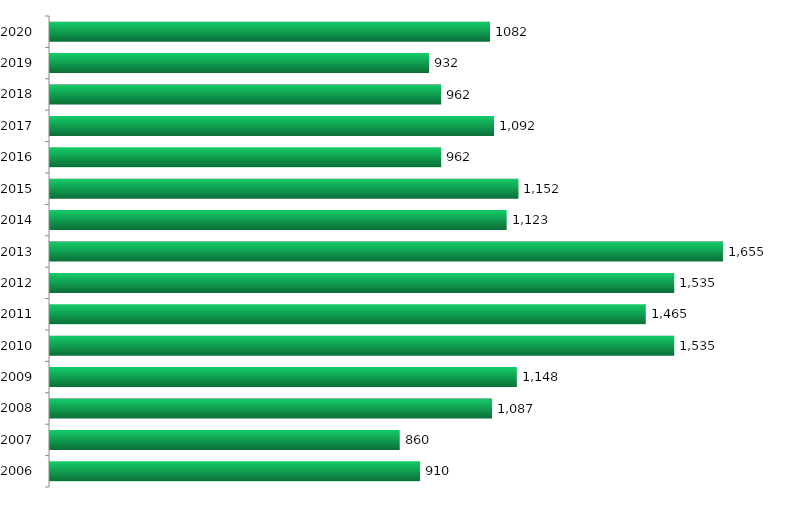
| Category | Vagas |
|---|---|
| 2006.0 | 910 |
| 2007.0 | 860 |
| 2008.0 | 1087 |
| 2009.0 | 1148 |
| 2010.0 | 1535 |
| 2011.0 | 1465 |
| 2012.0 | 1535 |
| 2013.0 | 1655 |
| 2014.0 | 1123 |
| 2015.0 | 1152 |
| 2016.0 | 962 |
| 2017.0 | 1092 |
| 2018.0 | 962 |
| 2019.0 | 932 |
| 2020.0 | 1082 |